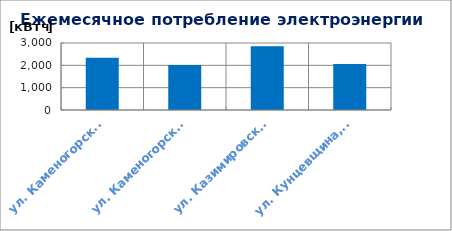
| Category | Series 0 |
|---|---|
| ул. Каменогорская, 30 | 2337.667 |
| ул. Каменогорская, 86 | 2015.667 |
| ул. Казимировская, 9 | 2849.75 |
| ул. Кунцевщина, 35 | 2063.083 |